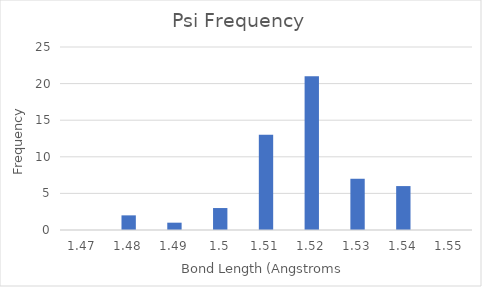
| Category | Psi |
|---|---|
| 1.47 | 0 |
| 1.48 | 2 |
| 1.49 | 1 |
| 1.5 | 3 |
| 1.51 | 13 |
| 1.52 | 21 |
| 1.53 | 7 |
| 1.54 | 6 |
| 1.55 | 0 |